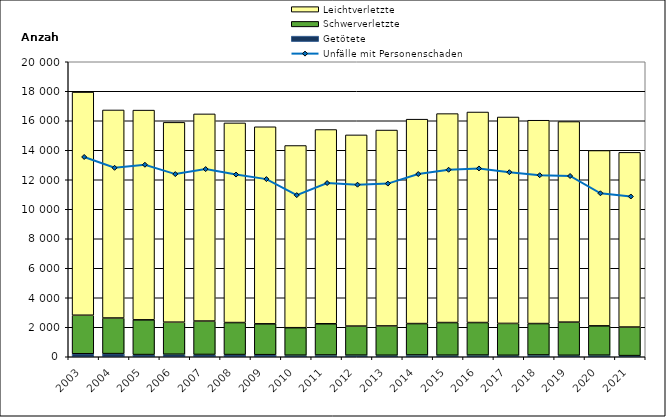
| Category | Getötete | Schwerverletzte | Leichtverletzte |
|---|---|---|---|
| 2003.0 | 204 | 2611 | 15128 |
| 2004.0 | 212 | 2415 | 14104 |
| 2005.0 | 148 | 2355 | 14219 |
| 2006.0 | 172 | 2173 | 13546 |
| 2007.0 | 156 | 2265 | 14043 |
| 2008.0 | 149 | 2169 | 13535 |
| 2009.0 | 140 | 2092 | 13360 |
| 2010.0 | 108 | 1862 | 12352 |
| 2011.0 | 120 | 2116 | 13169 |
| 2012.0 | 110 | 1970 | 12961 |
| 2013.0 | 103 | 1987 | 13280 |
| 2014.0 | 121 | 2128 | 13858 |
| 2015.0 | 107 | 2211 | 14167 |
| 2016.0 | 114 | 2205 | 14274 |
| 2017.0 | 100 | 2160 | 13995 |
| 2018.0 | 122 | 2129 | 13785 |
| 2019.0 | 100 | 2248 | 13597 |
| 2020.0 | 107 | 1988 | 11888 |
| 2021.0 | 77 | 1937 | 11844 |